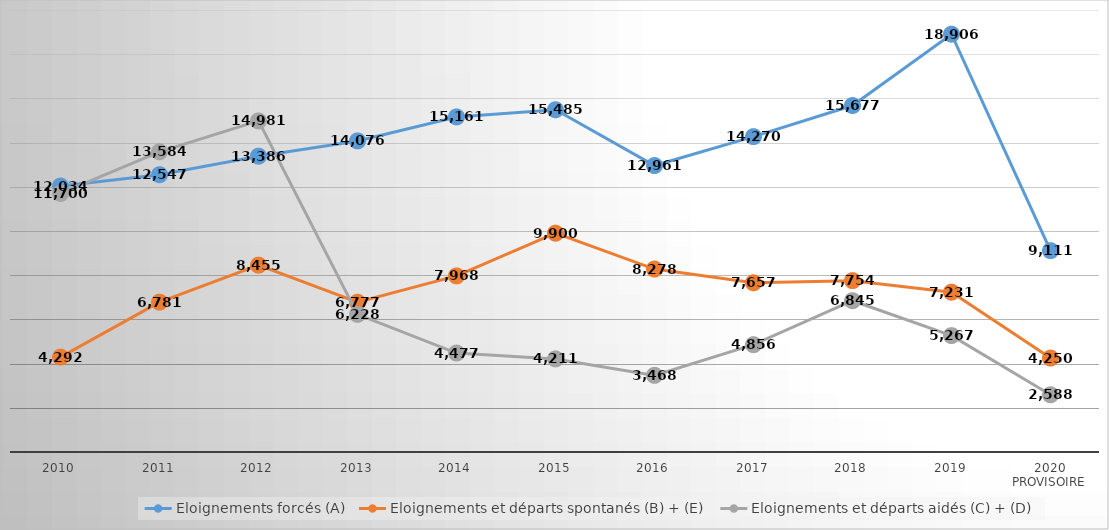
| Category | Eloignements forcés (A) | Eloignements et départs spontanés (B) + (E) | Eloignements et départs aidés (C) + (D) |
|---|---|---|---|
| 2010 | 12034 | 4292 | 11700 |
| 2011 | 12547 | 6781 | 13584 |
| 2012 | 13386 | 8455 | 14981 |
| 2013 | 14076 | 6777 | 6228 |
| 2014 | 15161 | 7968 | 4477 |
| 2015 | 15485 | 9900 | 4211 |
| 2016 | 12961 | 8278 | 3468 |
| 2017 | 14270 | 7657 | 4856 |
| 2018 | 15677 | 7754 | 6845 |
| 2019 | 18906 | 7231 | 5267 |
| 2020 provisoire | 9111 | 4250 | 2588 |